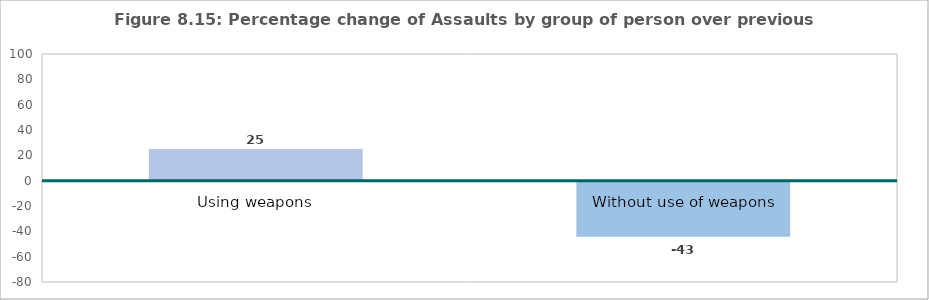
| Category | Series 0 |
|---|---|
| Using weapons | 25 |
| Without use of weapons | -43.478 |